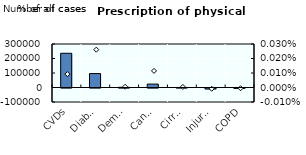
| Category | Number of cases |
|---|---|
| CVDs | 235962.806 |
| Diabetes | 96061.913 |
| Dementia | 1451.772 |
| Cancers | 23596.522 |
| Cirrhosis | 171.496 |
| Injuries | -6398.853 |
| COPD | -2718.699 |